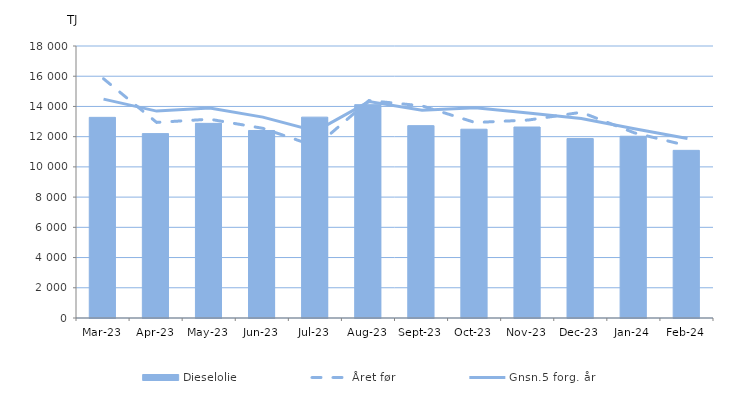
| Category | Dieselolie |
|---|---|
| 2023-03-01 | 13278.692 |
| 2023-04-01 | 12201.505 |
| 2023-05-01 | 12879.661 |
| 2023-06-01 | 12408.786 |
| 2023-07-01 | 13292.286 |
| 2023-08-01 | 14117.86 |
| 2023-09-01 | 12729.876 |
| 2023-10-01 | 12492.968 |
| 2023-11-01 | 12638.843 |
| 2023-12-01 | 11875.823 |
| 2024-01-01 | 12027.078 |
| 2024-02-01 | 11094.654 |